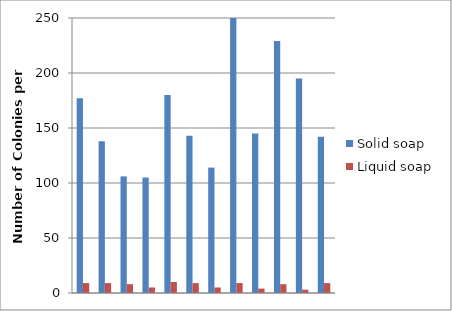
| Category | Solid soap | Liquid soap |
|---|---|---|
| 0 | 177 | 9 |
| 1 | 138 | 9 |
| 2 | 106 | 8 |
| 3 | 105 | 5 |
| 4 | 180 | 10 |
| 5 | 143 | 9 |
| 6 | 114 | 5 |
| 7 | 273 | 9 |
| 8 | 145 | 4 |
| 9 | 229 | 8 |
| 10 | 195 | 3 |
| 11 | 142 | 9 |